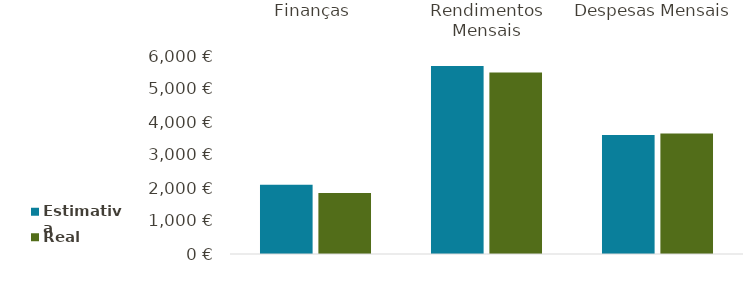
| Category | Estimativa | Real |
|---|---|---|
| Finanças | 2097 | 1845 |
| Rendimentos Mensais | 5700 | 5500 |
| Despesas Mensais | 3603 | 3655 |